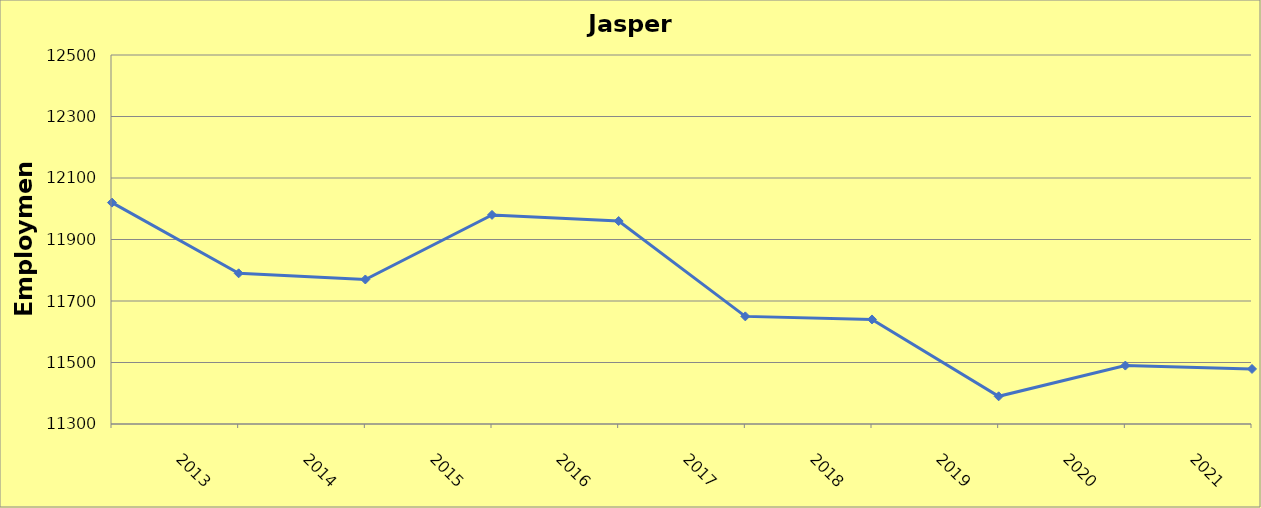
| Category | Jasper County |
|---|---|
| 2013.0 | 12020 |
| 2014.0 | 11790 |
| 2015.0 | 11770 |
| 2016.0 | 11980 |
| 2017.0 | 11960 |
| 2018.0 | 11650 |
| 2019.0 | 11640 |
| 2020.0 | 11390 |
| 2021.0 | 11490 |
| 2022.0 | 11479 |